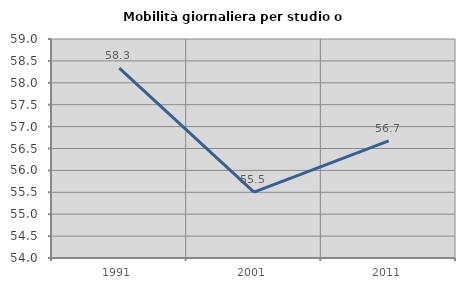
| Category | Mobilità giornaliera per studio o lavoro |
|---|---|
| 1991.0 | 58.335 |
| 2001.0 | 55.503 |
| 2011.0 | 56.675 |